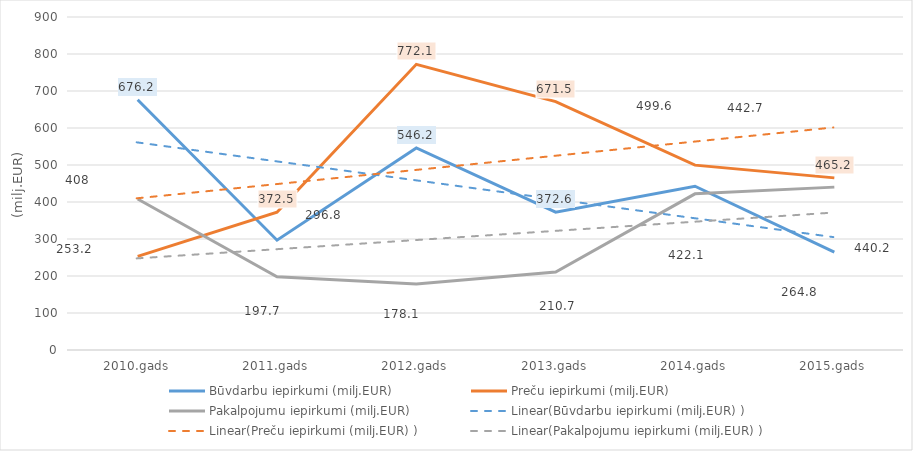
| Category | Būvdarbu iepirkumi (milj.EUR) | Preču iepirkumi (milj.EUR) | Pakalpojumu iepirkumi (milj.EUR) |
|---|---|---|---|
| 2010.gads | 676.2 | 253.2 | 408 |
| 2011.gads | 296.8 | 372.5 | 197.7 |
| 2012.gads | 546.2 | 772.1 | 178.1 |
| 2013.gads | 372.6 | 671.5 | 210.7 |
| 2014.gads | 442.7 | 499.6 | 422.1 |
| 2015.gads | 264.8 | 465.2 | 440.2 |